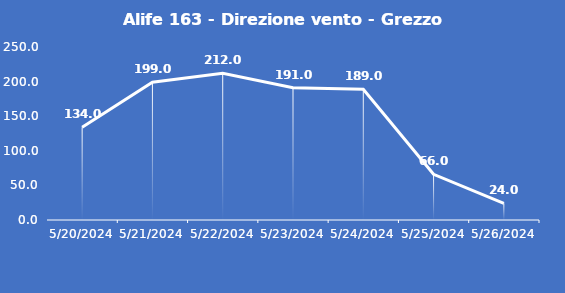
| Category | Alife 163 - Direzione vento - Grezzo (°N) |
|---|---|
| 5/20/24 | 134 |
| 5/21/24 | 199 |
| 5/22/24 | 212 |
| 5/23/24 | 191 |
| 5/24/24 | 189 |
| 5/25/24 | 66 |
| 5/26/24 | 24 |